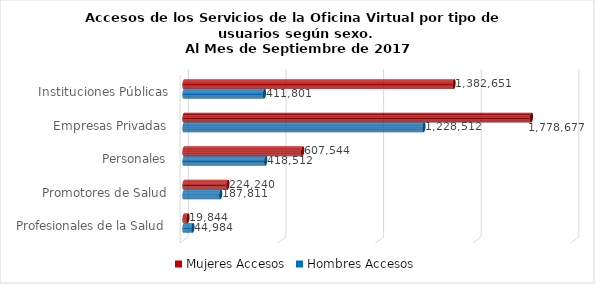
| Category | Mujeres | Hombres |
|---|---|---|
| Instituciones Públicas | 1382651 | 411801 |
| Empresas Privadas | 1778677 | 1228512 |
| Personales | 607544 | 418512 |
| Promotores de Salud | 224240 | 187811 |
| Profesionales de la Salud | 19844 | 44984 |